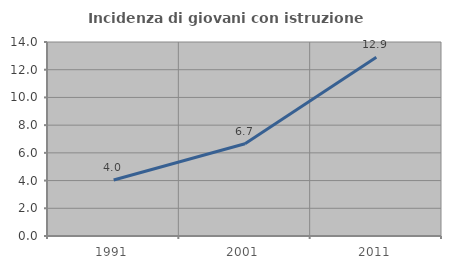
| Category | Incidenza di giovani con istruzione universitaria |
|---|---|
| 1991.0 | 4.038 |
| 2001.0 | 6.653 |
| 2011.0 | 12.893 |